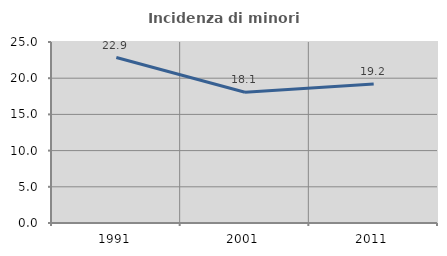
| Category | Incidenza di minori stranieri |
|---|---|
| 1991.0 | 22.857 |
| 2001.0 | 18.065 |
| 2011.0 | 19.208 |